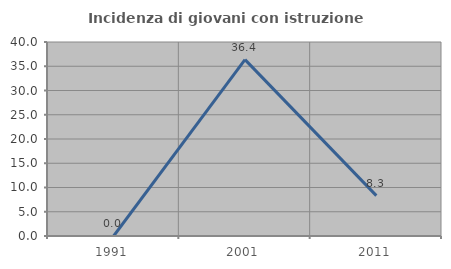
| Category | Incidenza di giovani con istruzione universitaria |
|---|---|
| 1991.0 | 0 |
| 2001.0 | 36.364 |
| 2011.0 | 8.333 |